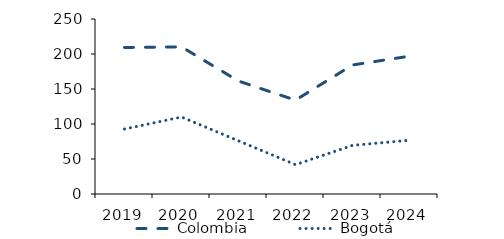
| Category | Colombia |
|---|---|
| 2019.0 | 209.333 |
| 2020.0 | 210.223 |
| 2021.0 | 161.323 |
| 2022.0 | 134.078 |
| 2023.0 | 184.315 |
| 2024.0 | 196.895 |